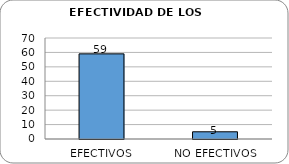
| Category | Series 0 |
|---|---|
| EFECTIVOS | 59 |
| NO EFECTIVOS | 5 |